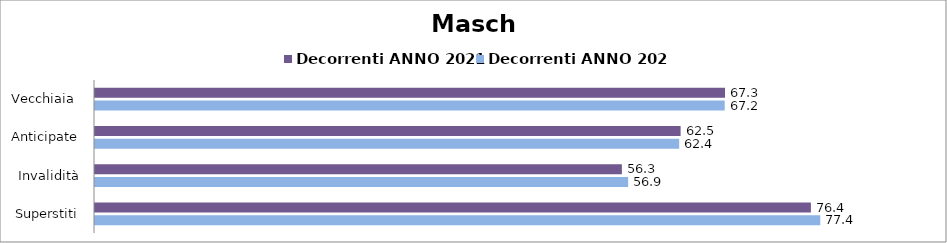
| Category | Decorrenti ANNO 2021 | Decorrenti ANNO 2022 |
|---|---|---|
| Vecchiaia  | 67.26 | 67.23 |
| Anticipate | 62.52 | 62.37 |
| Invalidità | 56.25 | 56.92 |
| Superstiti | 76.43 | 77.43 |